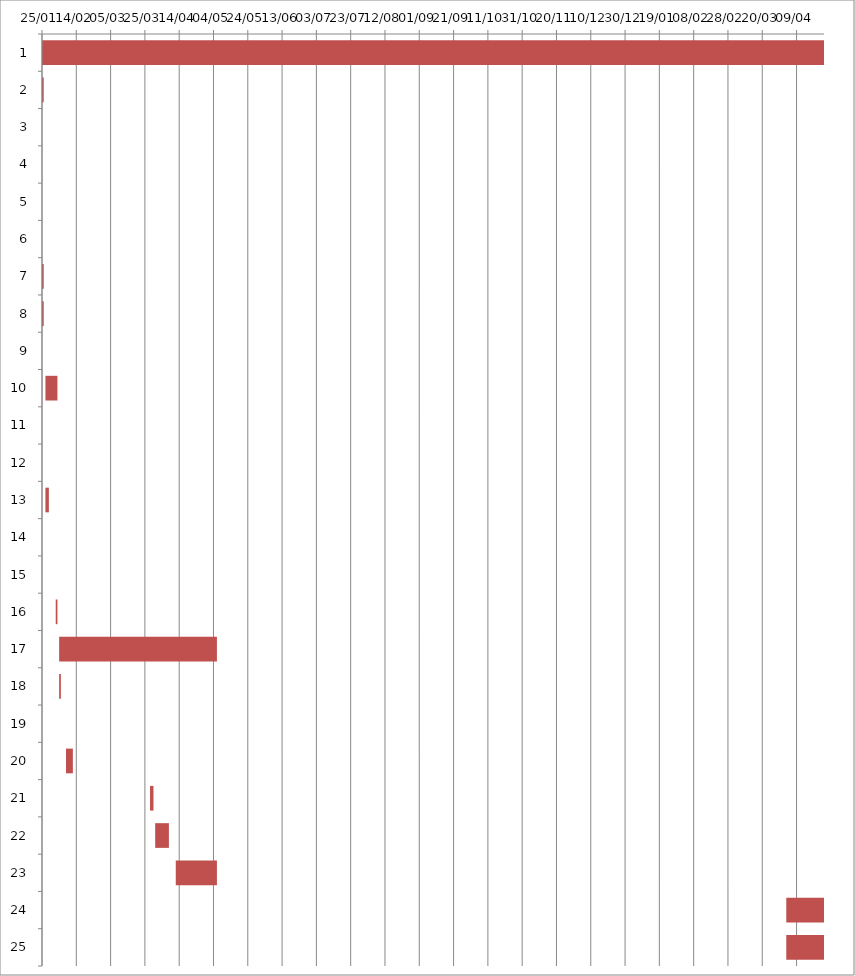
| Category | Fecha de inicio | DURACIÓN |
|---|---|---|
| 0 | 1/25/16 | 634 |
| 1 | 1/25/16 | 1 |
| 2 | 1/25/16 | 0 |
| 3 | 1/25/16 | 0 |
| 4 | 1/25/16 | 0 |
| 5 | 1/25/16 | 0 |
| 6 | 1/25/16 | 1 |
| 7 | 1/25/16 | 1 |
| 8 | 1/26/16 | 0 |
| 9 | 1/27/16 | 7 |
| 10 | 1/27/16 | 0 |
| 11 | 1/28/16 | 0 |
| 12 | 1/27/16 | 2 |
| 13 | 2/1/16 | 0 |
| 14 | 2/2/16 | 0 |
| 15 | 2/2/16 | 1 |
| 16 | 2/4/16 | 92 |
| 17 | 2/4/16 | 1 |
| 18 | 2/5/16 | 0 |
| 19 | 2/8/16 | 4 |
| 20 | 3/28/16 | 2 |
| 21 | 3/31/16 | 8 |
| 22 | 4/12/16 | 24 |
| 23 | 4/3/17 | 200 |
| 24 | 4/3/17 | 150 |